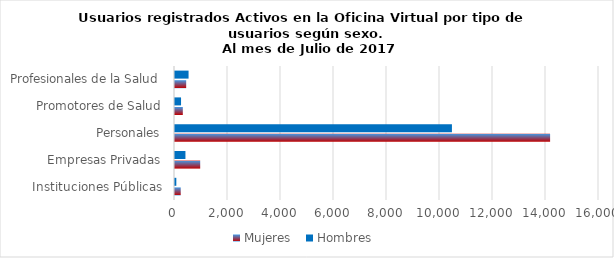
| Category | Mujeres | Hombres |
|---|---|---|
| Instituciones Públicas | 216 | 50 |
| Empresas Privadas | 951 | 394 |
| Personales | 14155 | 10450 |
| Promotores de Salud | 295 | 228 |
| Profesionales de la Salud | 422 | 512 |